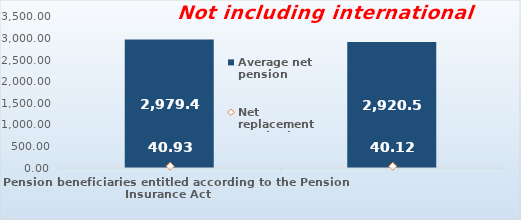
| Category | Average net pension  |
|---|---|
| Pension beneficiaries entitled according to the Pension Insurance Act   | 2979.47 |
| Pension beneficiaries entitled to pension FOR THE FIRST TIME in 2022 according to the Pension Insurance Act  - NEW BENEFICIARIES | 2920.583 |